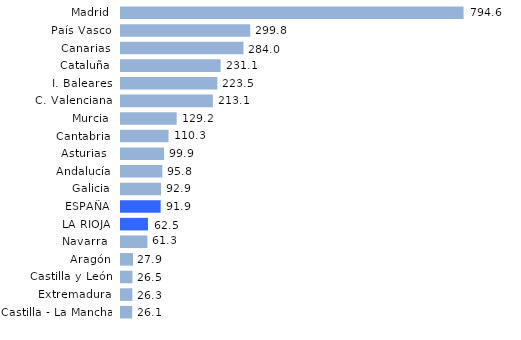
| Category | Series 0 |
|---|---|
| Castilla - La Mancha | 26.1 |
| Extremadura | 26.3 |
| Castilla y León | 26.5 |
| Aragón | 27.9 |
| Navarra  | 61.3 |
| LA RIOJA | 62.5 |
| ESPAÑA | 91.9 |
| Galicia | 92.9 |
| Andalucía | 95.8 |
| Asturias  | 99.9 |
| Cantabria | 110.3 |
| Murcia | 129.2 |
| C. Valenciana | 213.1 |
| I. Baleares | 223.5 |
| Cataluña | 231.1 |
| Canarias | 284 |
| País Vasco | 299.8 |
| Madrid | 794.6 |